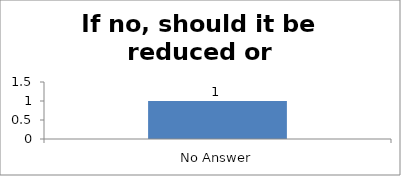
| Category | If no, should it be reduced or increased |
|---|---|
| No Answer | 1 |